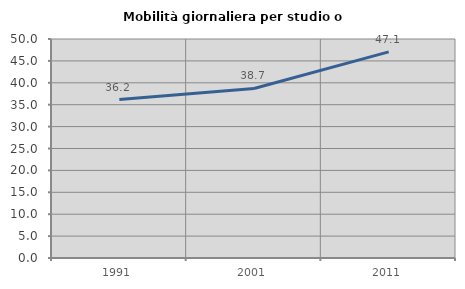
| Category | Mobilità giornaliera per studio o lavoro |
|---|---|
| 1991.0 | 36.166 |
| 2001.0 | 38.706 |
| 2011.0 | 47.059 |